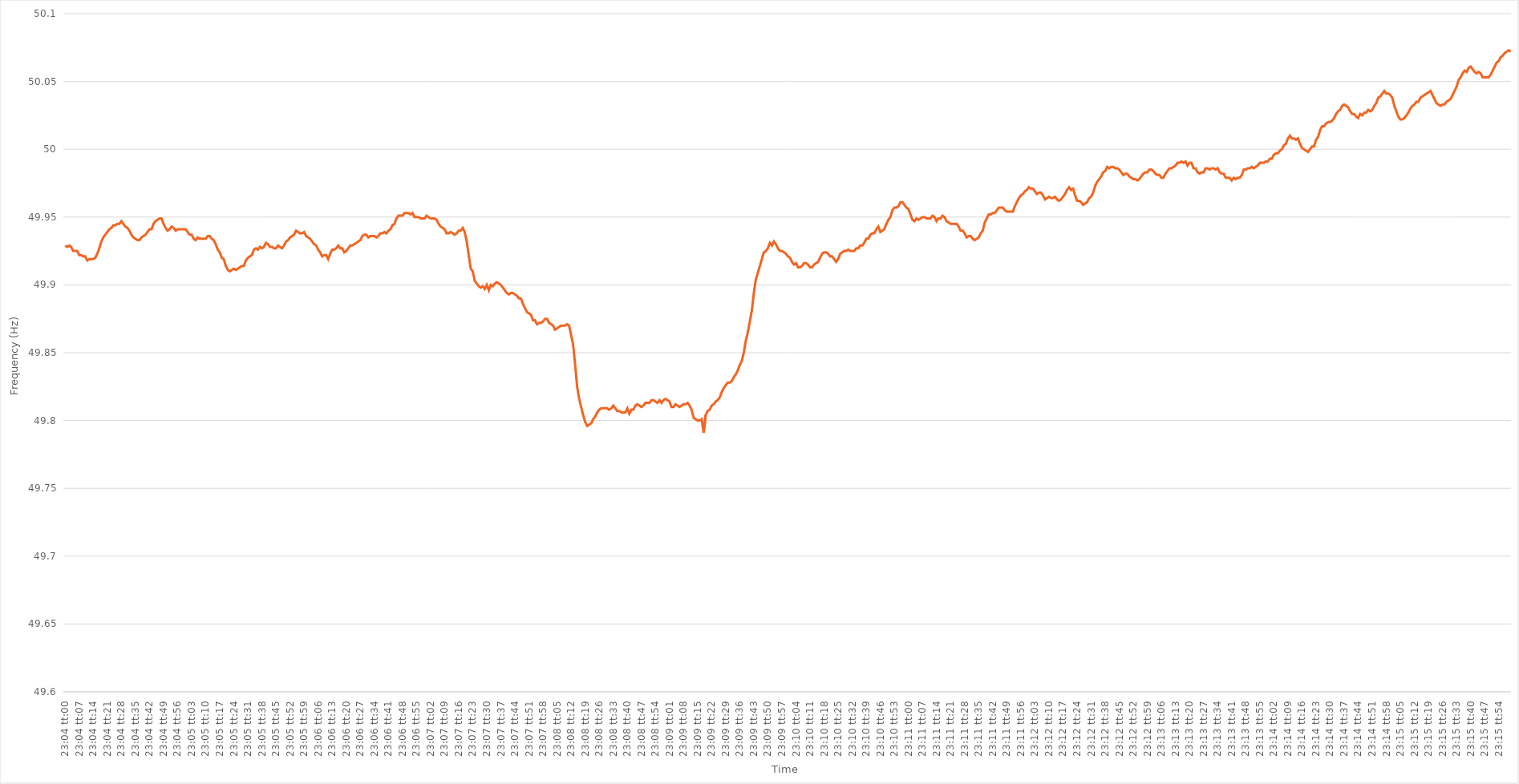
| Category | Series 0 |
|---|---|
| 0.9611111111111111 | 49.929 |
| 0.9611226851851852 | 49.928 |
| 0.9611342592592593 | 49.929 |
| 0.9611458333333333 | 49.928 |
| 0.9611574074074074 | 49.925 |
| 0.9611689814814816 | 49.925 |
| 0.9611805555555555 | 49.925 |
| 0.9611921296296296 | 49.922 |
| 0.9612037037037037 | 49.922 |
| 0.9612152777777778 | 49.921 |
| 0.9612268518518517 | 49.921 |
| 0.9612384259259259 | 49.918 |
| 0.96125 | 49.919 |
| 0.9612615740740741 | 49.919 |
| 0.9612731481481481 | 49.919 |
| 0.9612847222222222 | 49.92 |
| 0.9612962962962963 | 49.923 |
| 0.9613078703703705 | 49.927 |
| 0.9613194444444444 | 49.932 |
| 0.9613310185185185 | 49.935 |
| 0.9613425925925926 | 49.937 |
| 0.9613541666666667 | 49.939 |
| 0.9613657407407407 | 49.941 |
| 0.9613773148148148 | 49.942 |
| 0.961388888888889 | 49.944 |
| 0.961400462962963 | 49.944 |
| 0.961412037037037 | 49.945 |
| 0.9614236111111111 | 49.945 |
| 0.9614351851851852 | 49.947 |
| 0.9614467592592592 | 49.945 |
| 0.9614583333333333 | 49.943 |
| 0.9614699074074075 | 49.942 |
| 0.9614814814814815 | 49.94 |
| 0.9614930555555555 | 49.937 |
| 0.9615046296296296 | 49.935 |
| 0.9615162037037037 | 49.934 |
| 0.9615277777777779 | 49.933 |
| 0.9615393518518518 | 49.933 |
| 0.961550925925926 | 49.935 |
| 0.9615625 | 49.936 |
| 0.9615740740740741 | 49.937 |
| 0.9615856481481481 | 49.939 |
| 0.9615972222222222 | 49.941 |
| 0.9616087962962964 | 49.941 |
| 0.9616203703703704 | 49.945 |
| 0.9616319444444444 | 49.947 |
| 0.9616435185185185 | 49.948 |
| 0.9616550925925926 | 49.949 |
| 0.9616666666666666 | 49.949 |
| 0.9616782407407407 | 49.945 |
| 0.9616898148148149 | 49.942 |
| 0.9617013888888889 | 49.94 |
| 0.9617129629629629 | 49.941 |
| 0.961724537037037 | 49.943 |
| 0.9617361111111111 | 49.942 |
| 0.9617476851851853 | 49.94 |
| 0.9617592592592592 | 49.941 |
| 0.9617708333333334 | 49.941 |
| 0.9617824074074074 | 49.941 |
| 0.9617939814814815 | 49.941 |
| 0.9618055555555555 | 49.941 |
| 0.9618171296296296 | 49.939 |
| 0.9618287037037038 | 49.937 |
| 0.9618402777777778 | 49.937 |
| 0.9618518518518518 | 49.934 |
| 0.9618634259259259 | 49.933 |
| 0.961875 | 49.935 |
| 0.961886574074074 | 49.934 |
| 0.9618981481481481 | 49.934 |
| 0.9619097222222223 | 49.934 |
| 0.9619212962962963 | 49.934 |
| 0.9619328703703703 | 49.936 |
| 0.9619444444444444 | 49.936 |
| 0.9619560185185185 | 49.934 |
| 0.9619675925925927 | 49.933 |
| 0.9619791666666666 | 49.93 |
| 0.9619907407407408 | 49.926 |
| 0.9620023148148148 | 49.924 |
| 0.962013888888889 | 49.92 |
| 0.9620254629629629 | 49.919 |
| 0.962037037037037 | 49.914 |
| 0.9620486111111112 | 49.911 |
| 0.9620601851851852 | 49.91 |
| 0.9620717592592593 | 49.911 |
| 0.9620833333333333 | 49.912 |
| 0.9620949074074074 | 49.911 |
| 0.9621064814814816 | 49.912 |
| 0.9621180555555555 | 49.913 |
| 0.9621296296296297 | 49.914 |
| 0.9621412037037037 | 49.914 |
| 0.9621527777777777 | 49.918 |
| 0.9621643518518518 | 49.92 |
| 0.9621759259259259 | 49.921 |
| 0.9621875000000001 | 49.922 |
| 0.962199074074074 | 49.926 |
| 0.9622106481481482 | 49.927 |
| 0.9622222222222222 | 49.926 |
| 0.9622337962962964 | 49.928 |
| 0.9622453703703703 | 49.927 |
| 0.9622569444444444 | 49.928 |
| 0.9622685185185186 | 49.931 |
| 0.9622800925925926 | 49.93 |
| 0.9622916666666667 | 49.928 |
| 0.9623032407407407 | 49.928 |
| 0.9623148148148148 | 49.927 |
| 0.962326388888889 | 49.927 |
| 0.9623379629629629 | 49.929 |
| 0.9623495370370371 | 49.928 |
| 0.9623611111111111 | 49.927 |
| 0.9623726851851852 | 49.929 |
| 0.9623842592592592 | 49.932 |
| 0.9623958333333333 | 49.933 |
| 0.9624074074074075 | 49.935 |
| 0.9624189814814814 | 49.936 |
| 0.9624305555555556 | 49.937 |
| 0.9624421296296296 | 49.94 |
| 0.9624537037037038 | 49.939 |
| 0.9624652777777777 | 49.938 |
| 0.9624768518518518 | 49.938 |
| 0.962488425925926 | 49.939 |
| 0.9625 | 49.936 |
| 0.9625115740740741 | 49.935 |
| 0.9625231481481481 | 49.934 |
| 0.9625347222222222 | 49.932 |
| 0.9625462962962964 | 49.93 |
| 0.9625578703703703 | 49.929 |
| 0.9625694444444445 | 49.926 |
| 0.9625810185185185 | 49.924 |
| 0.9625925925925927 | 49.921 |
| 0.9626041666666666 | 49.922 |
| 0.9626157407407407 | 49.922 |
| 0.9626273148148149 | 49.919 |
| 0.9626388888888888 | 49.923 |
| 0.962650462962963 | 49.926 |
| 0.962662037037037 | 49.926 |
| 0.9626736111111112 | 49.927 |
| 0.9626851851851851 | 49.929 |
| 0.9626967592592592 | 49.927 |
| 0.9627083333333334 | 49.927 |
| 0.9627199074074074 | 49.924 |
| 0.9627314814814815 | 49.925 |
| 0.9627430555555555 | 49.927 |
| 0.9627546296296297 | 49.929 |
| 0.9627662037037038 | 49.929 |
| 0.9627777777777777 | 49.93 |
| 0.9627893518518519 | 49.931 |
| 0.9628009259259259 | 49.932 |
| 0.9628125000000001 | 49.933 |
| 0.962824074074074 | 49.936 |
| 0.9628356481481481 | 49.937 |
| 0.9628472222222223 | 49.937 |
| 0.9628587962962962 | 49.935 |
| 0.9628703703703704 | 49.936 |
| 0.9628819444444444 | 49.936 |
| 0.9628935185185186 | 49.936 |
| 0.9629050925925925 | 49.935 |
| 0.9629166666666666 | 49.936 |
| 0.9629282407407408 | 49.938 |
| 0.9629398148148148 | 49.938 |
| 0.9629513888888889 | 49.939 |
| 0.9629629629629629 | 49.938 |
| 0.9629745370370371 | 49.94 |
| 0.9629861111111112 | 49.941 |
| 0.9629976851851851 | 49.944 |
| 0.9630092592592593 | 49.945 |
| 0.9630208333333333 | 49.949 |
| 0.9630324074074075 | 49.951 |
| 0.9630439814814814 | 49.951 |
| 0.9630555555555556 | 49.951 |
| 0.9630671296296297 | 49.953 |
| 0.9630787037037036 | 49.953 |
| 0.9630902777777778 | 49.953 |
| 0.9631018518518518 | 49.952 |
| 0.963113425925926 | 49.953 |
| 0.9631249999999999 | 49.95 |
| 0.963136574074074 | 49.95 |
| 0.9631481481481482 | 49.95 |
| 0.9631597222222222 | 49.949 |
| 0.9631712962962963 | 49.949 |
| 0.9631828703703703 | 49.949 |
| 0.9631944444444445 | 49.951 |
| 0.9632060185185186 | 49.95 |
| 0.9632175925925925 | 49.949 |
| 0.9632291666666667 | 49.949 |
| 0.9632407407407407 | 49.949 |
| 0.9632523148148149 | 49.948 |
| 0.9632638888888888 | 49.945 |
| 0.963275462962963 | 49.943 |
| 0.9632870370370371 | 49.942 |
| 0.9632986111111111 | 49.941 |
| 0.9633101851851852 | 49.938 |
| 0.9633217592592592 | 49.938 |
| 0.9633333333333334 | 49.939 |
| 0.9633449074074073 | 49.938 |
| 0.9633564814814815 | 49.937 |
| 0.9633680555555556 | 49.938 |
| 0.9633796296296296 | 49.94 |
| 0.9633912037037037 | 49.94 |
| 0.9634027777777777 | 49.942 |
| 0.9634143518518519 | 49.939 |
| 0.963425925925926 | 49.932 |
| 0.9634375 | 49.922 |
| 0.9634490740740741 | 49.912 |
| 0.9634606481481481 | 49.91 |
| 0.9634722222222223 | 49.903 |
| 0.9634837962962962 | 49.901 |
| 0.9634953703703704 | 49.899 |
| 0.9635069444444445 | 49.898 |
| 0.9635185185185186 | 49.899 |
| 0.9635300925925926 | 49.897 |
| 0.9635416666666666 | 49.9 |
| 0.9635532407407408 | 49.896 |
| 0.9635648148148147 | 49.9 |
| 0.9635763888888889 | 49.899 |
| 0.963587962962963 | 49.901 |
| 0.963599537037037 | 49.902 |
| 0.9636111111111111 | 49.901 |
| 0.9636226851851851 | 49.9 |
| 0.9636342592592593 | 49.898 |
| 0.9636458333333334 | 49.896 |
| 0.9636574074074074 | 49.894 |
| 0.9636689814814815 | 49.893 |
| 0.9636805555555555 | 49.894 |
| 0.9636921296296297 | 49.894 |
| 0.9637037037037036 | 49.893 |
| 0.9637152777777778 | 49.892 |
| 0.9637268518518519 | 49.89 |
| 0.963738425925926 | 49.89 |
| 0.96375 | 49.886 |
| 0.963761574074074 | 49.883 |
| 0.9637731481481482 | 49.88 |
| 0.9637847222222221 | 49.879 |
| 0.9637962962962963 | 49.878 |
| 0.9638078703703704 | 49.874 |
| 0.9638194444444445 | 49.874 |
| 0.9638310185185185 | 49.871 |
| 0.9638425925925925 | 49.872 |
| 0.9638541666666667 | 49.872 |
| 0.9638657407407408 | 49.873 |
| 0.9638773148148148 | 49.875 |
| 0.9638888888888889 | 49.875 |
| 0.963900462962963 | 49.872 |
| 0.9639120370370371 | 49.871 |
| 0.963923611111111 | 49.87 |
| 0.9639351851851852 | 49.867 |
| 0.9639467592592593 | 49.868 |
| 0.9639583333333334 | 49.869 |
| 0.9639699074074074 | 49.87 |
| 0.9639814814814814 | 49.87 |
| 0.9639930555555556 | 49.87 |
| 0.9640046296296297 | 49.871 |
| 0.9640162037037037 | 49.87 |
| 0.9640277777777778 | 49.863 |
| 0.9640393518518519 | 49.856 |
| 0.9640509259259259 | 49.841 |
| 0.9640624999999999 | 49.825 |
| 0.9640740740740741 | 49.816 |
| 0.9640856481481482 | 49.81 |
| 0.9640972222222222 | 49.804 |
| 0.9641087962962963 | 49.799 |
| 0.9641203703703703 | 49.796 |
| 0.9641319444444445 | 49.797 |
| 0.9641435185185184 | 49.798 |
| 0.9641550925925926 | 49.801 |
| 0.9641666666666667 | 49.803 |
| 0.9641782407407408 | 49.806 |
| 0.9641898148148148 | 49.808 |
| 0.9642013888888888 | 49.809 |
| 0.964212962962963 | 49.809 |
| 0.9642245370370371 | 49.809 |
| 0.9642361111111111 | 49.809 |
| 0.9642476851851852 | 49.808 |
| 0.9642592592592593 | 49.809 |
| 0.9642708333333333 | 49.811 |
| 0.9642824074074073 | 49.809 |
| 0.9642939814814815 | 49.807 |
| 0.9643055555555556 | 49.807 |
| 0.9643171296296296 | 49.806 |
| 0.9643287037037037 | 49.806 |
| 0.9643402777777778 | 49.806 |
| 0.9643518518518519 | 49.809 |
| 0.9643634259259258 | 49.805 |
| 0.964375 | 49.808 |
| 0.9643865740740741 | 49.808 |
| 0.9643981481481482 | 49.811 |
| 0.9644097222222222 | 49.812 |
| 0.9644212962962962 | 49.811 |
| 0.9644328703703704 | 49.81 |
| 0.9644444444444445 | 49.811 |
| 0.9644560185185185 | 49.813 |
| 0.9644675925925926 | 49.813 |
| 0.9644791666666667 | 49.813 |
| 0.9644907407407407 | 49.815 |
| 0.9645023148148147 | 49.815 |
| 0.9645138888888889 | 49.814 |
| 0.964525462962963 | 49.813 |
| 0.964537037037037 | 49.815 |
| 0.9645486111111111 | 49.813 |
| 0.9645601851851852 | 49.815 |
| 0.9645717592592593 | 49.816 |
| 0.9645833333333332 | 49.815 |
| 0.9645949074074074 | 49.814 |
| 0.9646064814814815 | 49.81 |
| 0.9646180555555556 | 49.81 |
| 0.9646296296296296 | 49.812 |
| 0.9646412037037037 | 49.811 |
| 0.9646527777777778 | 49.81 |
| 0.964664351851852 | 49.811 |
| 0.9646759259259259 | 49.812 |
| 0.9646875 | 49.812 |
| 0.9646990740740741 | 49.813 |
| 0.9647106481481482 | 49.811 |
| 0.9647222222222221 | 49.808 |
| 0.9647337962962963 | 49.802 |
| 0.9647453703703704 | 49.801 |
| 0.9647569444444444 | 49.8 |
| 0.9647685185185185 | 49.8 |
| 0.9647800925925926 | 49.801 |
| 0.9647916666666667 | 49.791 |
| 0.9648032407407406 | 49.804 |
| 0.9648148148148148 | 49.807 |
| 0.9648263888888889 | 49.808 |
| 0.964837962962963 | 49.811 |
| 0.964849537037037 | 49.812 |
| 0.9648611111111111 | 49.814 |
| 0.9648726851851852 | 49.815 |
| 0.9648842592592594 | 49.817 |
| 0.9648958333333333 | 49.821 |
| 0.9649074074074074 | 49.824 |
| 0.9649189814814815 | 49.826 |
| 0.9649305555555556 | 49.828 |
| 0.9649421296296296 | 49.828 |
| 0.9649537037037037 | 49.829 |
| 0.9649652777777779 | 49.832 |
| 0.9649768518518518 | 49.834 |
| 0.9649884259259259 | 49.837 |
| 0.965 | 49.841 |
| 0.9650115740740741 | 49.844 |
| 0.965023148148148 | 49.85 |
| 0.9650347222222222 | 49.859 |
| 0.9650462962962963 | 49.865 |
| 0.9650578703703704 | 49.873 |
| 0.9650694444444444 | 49.881 |
| 0.9650810185185185 | 49.894 |
| 0.9650925925925926 | 49.904 |
| 0.9651041666666668 | 49.909 |
| 0.9651157407407407 | 49.914 |
| 0.9651273148148148 | 49.919 |
| 0.9651388888888889 | 49.924 |
| 0.965150462962963 | 49.925 |
| 0.965162037037037 | 49.927 |
| 0.9651736111111111 | 49.931 |
| 0.9651851851851853 | 49.929 |
| 0.9651967592592593 | 49.932 |
| 0.9652083333333333 | 49.93 |
| 0.9652199074074074 | 49.927 |
| 0.9652314814814815 | 49.925 |
| 0.9652430555555555 | 49.925 |
| 0.9652546296296296 | 49.924 |
| 0.9652662037037038 | 49.923 |
| 0.9652777777777778 | 49.921 |
| 0.9652893518518518 | 49.92 |
| 0.9653009259259259 | 49.917 |
| 0.9653125 | 49.915 |
| 0.9653240740740742 | 49.916 |
| 0.9653356481481481 | 49.913 |
| 0.9653472222222222 | 49.913 |
| 0.9653587962962963 | 49.914 |
| 0.9653703703703704 | 49.916 |
| 0.9653819444444444 | 49.916 |
| 0.9653935185185185 | 49.915 |
| 0.9654050925925927 | 49.913 |
| 0.9654166666666667 | 49.913 |
| 0.9654282407407407 | 49.915 |
| 0.9654398148148148 | 49.916 |
| 0.9654513888888889 | 49.917 |
| 0.9654629629629629 | 49.92 |
| 0.965474537037037 | 49.923 |
| 0.9654861111111112 | 49.924 |
| 0.9654976851851852 | 49.924 |
| 0.9655092592592592 | 49.923 |
| 0.9655208333333333 | 49.921 |
| 0.9655324074074074 | 49.921 |
| 0.9655439814814816 | 49.919 |
| 0.9655555555555555 | 49.917 |
| 0.9655671296296297 | 49.919 |
| 0.9655787037037037 | 49.923 |
| 0.9655902777777778 | 49.924 |
| 0.9656018518518518 | 49.925 |
| 0.9656134259259259 | 49.925 |
| 0.9656250000000001 | 49.926 |
| 0.9656365740740741 | 49.925 |
| 0.9656481481481481 | 49.925 |
| 0.9656597222222222 | 49.925 |
| 0.9656712962962963 | 49.927 |
| 0.9656828703703703 | 49.927 |
| 0.9656944444444444 | 49.929 |
| 0.9657060185185186 | 49.929 |
| 0.9657175925925926 | 49.931 |
| 0.9657291666666666 | 49.934 |
| 0.9657407407407407 | 49.934 |
| 0.9657523148148148 | 49.937 |
| 0.965763888888889 | 49.938 |
| 0.9657754629629629 | 49.938 |
| 0.965787037037037 | 49.941 |
| 0.9657986111111111 | 49.943 |
| 0.9658101851851852 | 49.939 |
| 0.9658217592592592 | 49.94 |
| 0.9658333333333333 | 49.941 |
| 0.9658449074074075 | 49.945 |
| 0.9658564814814815 | 49.948 |
| 0.9658680555555555 | 49.95 |
| 0.9658796296296296 | 49.955 |
| 0.9658912037037037 | 49.957 |
| 0.9659027777777779 | 49.957 |
| 0.9659143518518518 | 49.958 |
| 0.965925925925926 | 49.961 |
| 0.9659375 | 49.961 |
| 0.965949074074074 | 49.959 |
| 0.9659606481481481 | 49.957 |
| 0.9659722222222222 | 49.956 |
| 0.9659837962962964 | 49.952 |
| 0.9659953703703703 | 49.948 |
| 0.9660069444444445 | 49.947 |
| 0.9660185185185185 | 49.949 |
| 0.9660300925925926 | 49.948 |
| 0.9660416666666666 | 49.949 |
| 0.9660532407407407 | 49.95 |
| 0.9660648148148149 | 49.95 |
| 0.9660763888888889 | 49.949 |
| 0.966087962962963 | 49.949 |
| 0.966099537037037 | 49.949 |
| 0.9661111111111111 | 49.951 |
| 0.9661226851851853 | 49.95 |
| 0.9661342592592592 | 49.947 |
| 0.9661458333333334 | 49.949 |
| 0.9661574074074074 | 49.949 |
| 0.9661689814814814 | 49.951 |
| 0.9661805555555555 | 49.95 |
| 0.9661921296296296 | 49.947 |
| 0.9662037037037038 | 49.946 |
| 0.9662152777777777 | 49.945 |
| 0.9662268518518519 | 49.945 |
| 0.9662384259259259 | 49.945 |
| 0.96625 | 49.945 |
| 0.966261574074074 | 49.943 |
| 0.9662731481481481 | 49.94 |
| 0.9662847222222223 | 49.94 |
| 0.9662962962962963 | 49.938 |
| 0.9663078703703704 | 49.935 |
| 0.9663194444444444 | 49.936 |
| 0.9663310185185185 | 49.936 |
| 0.9663425925925927 | 49.934 |
| 0.9663541666666666 | 49.933 |
| 0.9663657407407408 | 49.934 |
| 0.9663773148148148 | 49.935 |
| 0.9663888888888889 | 49.938 |
| 0.9664004629629629 | 49.94 |
| 0.966412037037037 | 49.946 |
| 0.9664236111111112 | 49.949 |
| 0.9664351851851851 | 49.952 |
| 0.9664467592592593 | 49.952 |
| 0.9664583333333333 | 49.953 |
| 0.9664699074074075 | 49.953 |
| 0.9664814814814814 | 49.955 |
| 0.9664930555555555 | 49.957 |
| 0.9665046296296297 | 49.957 |
| 0.9665162037037037 | 49.957 |
| 0.9665277777777778 | 49.955 |
| 0.9665393518518518 | 49.954 |
| 0.966550925925926 | 49.954 |
| 0.9665625000000001 | 49.954 |
| 0.966574074074074 | 49.954 |
| 0.9665856481481482 | 49.958 |
| 0.9665972222222222 | 49.961 |
| 0.9666087962962964 | 49.964 |
| 0.9666203703703703 | 49.966 |
| 0.9666319444444444 | 49.967 |
| 0.9666435185185186 | 49.969 |
| 0.9666550925925925 | 49.97 |
| 0.9666666666666667 | 49.972 |
| 0.9666782407407407 | 49.971 |
| 0.9666898148148149 | 49.971 |
| 0.9667013888888888 | 49.969 |
| 0.9667129629629629 | 49.967 |
| 0.9667245370370371 | 49.968 |
| 0.9667361111111111 | 49.968 |
| 0.9667476851851852 | 49.966 |
| 0.9667592592592592 | 49.963 |
| 0.9667708333333334 | 49.964 |
| 0.9667824074074075 | 49.965 |
| 0.9667939814814814 | 49.964 |
| 0.9668055555555556 | 49.964 |
| 0.9668171296296296 | 49.965 |
| 0.9668287037037038 | 49.963 |
| 0.9668402777777777 | 49.962 |
| 0.9668518518518519 | 49.963 |
| 0.966863425925926 | 49.965 |
| 0.9668749999999999 | 49.967 |
| 0.9668865740740741 | 49.97 |
| 0.9668981481481481 | 49.972 |
| 0.9669097222222223 | 49.97 |
| 0.9669212962962962 | 49.971 |
| 0.9669328703703703 | 49.966 |
| 0.9669444444444445 | 49.962 |
| 0.9669560185185185 | 49.962 |
| 0.9669675925925926 | 49.961 |
| 0.9669791666666666 | 49.959 |
| 0.9669907407407408 | 49.96 |
| 0.9670023148148149 | 49.961 |
| 0.9670138888888888 | 49.964 |
| 0.967025462962963 | 49.965 |
| 0.967037037037037 | 49.968 |
| 0.9670486111111112 | 49.973 |
| 0.9670601851851851 | 49.976 |
| 0.9670717592592593 | 49.978 |
| 0.9670833333333334 | 49.98 |
| 0.9670949074074073 | 49.983 |
| 0.9671064814814815 | 49.984 |
| 0.9671180555555555 | 49.987 |
| 0.9671296296296297 | 49.986 |
| 0.9671412037037036 | 49.987 |
| 0.9671527777777778 | 49.987 |
| 0.9671643518518519 | 49.986 |
| 0.9671759259259259 | 49.986 |
| 0.9671875 | 49.985 |
| 0.967199074074074 | 49.983 |
| 0.9672106481481482 | 49.981 |
| 0.9672222222222223 | 49.982 |
| 0.9672337962962962 | 49.982 |
| 0.9672453703703704 | 49.98 |
| 0.9672569444444444 | 49.979 |
| 0.9672685185185186 | 49.978 |
| 0.9672800925925925 | 49.978 |
| 0.9672916666666667 | 49.977 |
| 0.9673032407407408 | 49.978 |
| 0.9673148148148148 | 49.98 |
| 0.9673263888888889 | 49.982 |
| 0.9673379629629629 | 49.983 |
| 0.9673495370370371 | 49.983 |
| 0.967361111111111 | 49.985 |
| 0.9673726851851852 | 49.985 |
| 0.9673842592592593 | 49.984 |
| 0.9673958333333333 | 49.982 |
| 0.9674074074074074 | 49.981 |
| 0.9674189814814814 | 49.981 |
| 0.9674305555555556 | 49.979 |
| 0.9674421296296297 | 49.979 |
| 0.9674537037037036 | 49.982 |
| 0.9674652777777778 | 49.984 |
| 0.9674768518518518 | 49.986 |
| 0.967488425925926 | 49.986 |
| 0.9674999999999999 | 49.987 |
| 0.9675115740740741 | 49.988 |
| 0.9675231481481482 | 49.99 |
| 0.9675347222222223 | 49.99 |
| 0.9675462962962963 | 49.991 |
| 0.9675578703703703 | 49.99 |
| 0.9675694444444445 | 49.991 |
| 0.9675810185185184 | 49.988 |
| 0.9675925925925926 | 49.99 |
| 0.9676041666666667 | 49.99 |
| 0.9676157407407407 | 49.986 |
| 0.9676273148148148 | 49.986 |
| 0.9676388888888888 | 49.983 |
| 0.967650462962963 | 49.982 |
| 0.9676620370370371 | 49.983 |
| 0.967673611111111 | 49.983 |
| 0.9676851851851852 | 49.986 |
| 0.9676967592592592 | 49.986 |
| 0.9677083333333334 | 49.985 |
| 0.9677199074074073 | 49.986 |
| 0.9677314814814815 | 49.986 |
| 0.9677430555555556 | 49.985 |
| 0.9677546296296297 | 49.986 |
| 0.9677662037037037 | 49.983 |
| 0.9677777777777777 | 49.982 |
| 0.9677893518518519 | 49.982 |
| 0.967800925925926 | 49.979 |
| 0.9678125 | 49.979 |
| 0.9678240740740741 | 49.979 |
| 0.9678356481481482 | 49.977 |
| 0.9678472222222222 | 49.979 |
| 0.9678587962962962 | 49.978 |
| 0.9678703703703704 | 49.979 |
| 0.9678819444444445 | 49.979 |
| 0.9678935185185185 | 49.981 |
| 0.9679050925925926 | 49.985 |
| 0.9679166666666666 | 49.985 |
| 0.9679282407407408 | 49.986 |
| 0.9679398148148147 | 49.986 |
| 0.9679513888888889 | 49.987 |
| 0.967962962962963 | 49.986 |
| 0.9679745370370371 | 49.987 |
| 0.9679861111111111 | 49.988 |
| 0.9679976851851851 | 49.99 |
| 0.9680092592592593 | 49.99 |
| 0.9680208333333334 | 49.99 |
| 0.9680324074074074 | 49.991 |
| 0.9680439814814815 | 49.991 |
| 0.9680555555555556 | 49.993 |
| 0.9680671296296296 | 49.993 |
| 0.9680787037037036 | 49.996 |
| 0.9680902777777778 | 49.997 |
| 0.9681018518518519 | 49.997 |
| 0.9681134259259259 | 49.999 |
| 0.968125 | 50 |
| 0.968136574074074 | 50.003 |
| 0.9681481481481482 | 50.004 |
| 0.9681597222222221 | 50.008 |
| 0.9681712962962963 | 50.01 |
| 0.9681828703703704 | 50.008 |
| 0.9681944444444445 | 50.008 |
| 0.9682060185185185 | 50.007 |
| 0.9682175925925925 | 50.008 |
| 0.9682291666666667 | 50.004 |
| 0.9682407407407408 | 50.001 |
| 0.9682523148148148 | 50 |
| 0.9682638888888889 | 49.999 |
| 0.968275462962963 | 49.998 |
| 0.968287037037037 | 50 |
| 0.968298611111111 | 50.002 |
| 0.9683101851851852 | 50.002 |
| 0.9683217592592593 | 50.007 |
| 0.9683333333333333 | 50.009 |
| 0.9683449074074074 | 50.014 |
| 0.9683564814814815 | 50.017 |
| 0.9683680555555556 | 50.017 |
| 0.9683796296296295 | 50.019 |
| 0.9683912037037037 | 50.02 |
| 0.9684027777777778 | 50.02 |
| 0.9684143518518519 | 50.021 |
| 0.9684259259259259 | 50.023 |
| 0.9684375 | 50.026 |
| 0.9684490740740741 | 50.028 |
| 0.9684606481481483 | 50.029 |
| 0.9684722222222222 | 50.032 |
| 0.9684837962962963 | 50.033 |
| 0.9684953703703704 | 50.032 |
| 0.9685069444444445 | 50.031 |
| 0.9685185185185184 | 50.028 |
| 0.9685300925925926 | 50.026 |
| 0.9685416666666667 | 50.026 |
| 0.9685532407407407 | 50.024 |
| 0.9685648148148148 | 50.023 |
| 0.9685763888888889 | 50.026 |
| 0.968587962962963 | 50.025 |
| 0.9685995370370369 | 50.027 |
| 0.9686111111111111 | 50.027 |
| 0.9686226851851852 | 50.029 |
| 0.9686342592592593 | 50.028 |
| 0.9686458333333333 | 50.029 |
| 0.9686574074074074 | 50.032 |
| 0.9686689814814815 | 50.034 |
| 0.9686805555555557 | 50.038 |
| 0.9686921296296296 | 50.039 |
| 0.9687037037037037 | 50.041 |
| 0.9687152777777778 | 50.043 |
| 0.9687268518518519 | 50.041 |
| 0.9687384259259259 | 50.041 |
| 0.96875 | 50.04 |
| 0.9687615740740741 | 50.038 |
| 0.9687731481481481 | 50.032 |
| 0.9687847222222222 | 50.028 |
| 0.9687962962962963 | 50.024 |
| 0.9688078703703704 | 50.022 |
| 0.9688194444444443 | 50.022 |
| 0.9688310185185185 | 50.023 |
| 0.9688425925925926 | 50.025 |
| 0.9688541666666667 | 50.027 |
| 0.9688657407407407 | 50.03 |
| 0.9688773148148148 | 50.032 |
| 0.9688888888888889 | 50.033 |
| 0.9689004629629631 | 50.035 |
| 0.968912037037037 | 50.035 |
| 0.9689236111111111 | 50.038 |
| 0.9689351851851852 | 50.039 |
| 0.9689467592592593 | 50.04 |
| 0.9689583333333333 | 50.041 |
| 0.9689699074074074 | 50.042 |
| 0.9689814814814816 | 50.043 |
| 0.9689930555555555 | 50.04 |
| 0.9690046296296296 | 50.037 |
| 0.9690162037037037 | 50.034 |
| 0.9690277777777778 | 50.033 |
| 0.9690393518518517 | 50.032 |
| 0.9690509259259259 | 50.033 |
| 0.9690625 | 50.033 |
| 0.9690740740740741 | 50.035 |
| 0.9690856481481481 | 50.036 |
| 0.9690972222222222 | 50.037 |
| 0.9691087962962963 | 50.04 |
| 0.9691203703703705 | 50.043 |
| 0.9691319444444444 | 50.046 |
| 0.9691435185185185 | 50.051 |
| 0.9691550925925926 | 50.053 |
| 0.9691666666666667 | 50.056 |
| 0.9691782407407407 | 50.058 |
| 0.9691898148148148 | 50.057 |
| 0.969201388888889 | 50.06 |
| 0.969212962962963 | 50.061 |
| 0.969224537037037 | 50.059 |
| 0.9692361111111111 | 50.057 |
| 0.9692476851851852 | 50.056 |
| 0.9692592592592592 | 50.057 |
| 0.9692708333333333 | 50.056 |
| 0.9692824074074075 | 50.053 |
| 0.9692939814814815 | 50.053 |
| 0.9693055555555555 | 50.053 |
| 0.9693171296296296 | 50.053 |
| 0.9693287037037037 | 50.055 |
| 0.9693402777777779 | 50.058 |
| 0.9693518518518518 | 50.061 |
| 0.969363425925926 | 50.064 |
| 0.969375 | 50.065 |
| 0.9693865740740741 | 50.068 |
| 0.9693981481481481 | 50.069 |
| 0.9694097222222222 | 50.071 |
| 0.9694212962962964 | 50.072 |
| 0.9694328703703704 | 50.073 |
| 0.9694444444444444 | 50.072 |